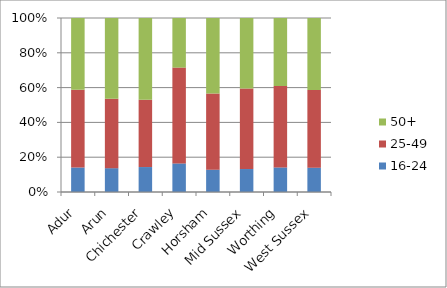
| Category | 16-24 | 25-49 | 50+ |
|---|---|---|---|
| Adur | 5377 | 17043 | 15757 |
| Arun | 13021 | 37842 | 44147 |
| Chichester | 10860 | 29277 | 35611 |
| Crawley | 11102 | 37211 | 19259 |
| Horsham | 11309 | 38506 | 38191 |
| Mid Sussex | 12329 | 43197 | 37880 |
| Worthing | 9305 | 30815 | 25751 |
| West Sussex | 73303 | 233891 | 216596 |